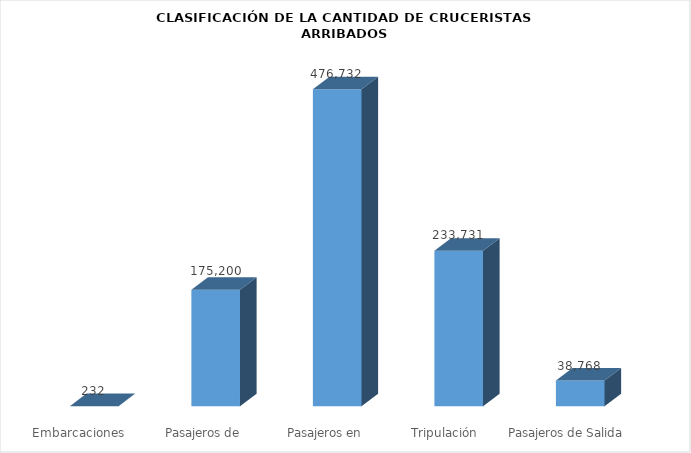
| Category | Series 0 |
|---|---|
| Embarcaciones  | 232 |
| Pasajeros de Entrada | 175200 |
| Pasajeros en Tránsito | 476732 |
| Tripulación | 233731 |
| Pasajeros de Salida | 38768 |